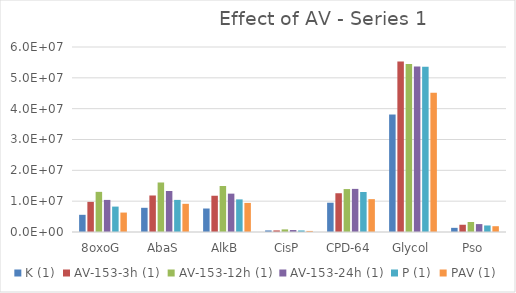
| Category | K (1) | AV-153-3h (1) | AV-153-12h (1) | AV-153-24h (1) | P (1) | PAV (1) |
|---|---|---|---|---|---|---|
| 8oxoG | 5574185 | 9770241.5 | 13021423 | 10406547.5 | 8240042.5 | 6305558 |
| AbaS | 7846556 | 11840324 | 16058357.5 | 13298264 | 10410663.5 | 9138200 |
| AlkB | 7619358.5 | 11759510.5 | 14921560 | 12439596 | 10576645 | 9432049 |
| CisP | 508904 | 515523 | 842058 | 635827 | 506113 | 345693 |
| CPD-64 | 9498738 | 12569129 | 13927796 | 13983943.5 | 12969281 | 10653113 |
| Glycol | 38102489.5 | 55302041.5 | 54466255.5 | 53705356 | 53569829.5 | 45190454.5 |
| Pso | 1348511 | 2352274.5 | 3244829.5 | 2564263.5 | 2117713.5 | 1877311 |